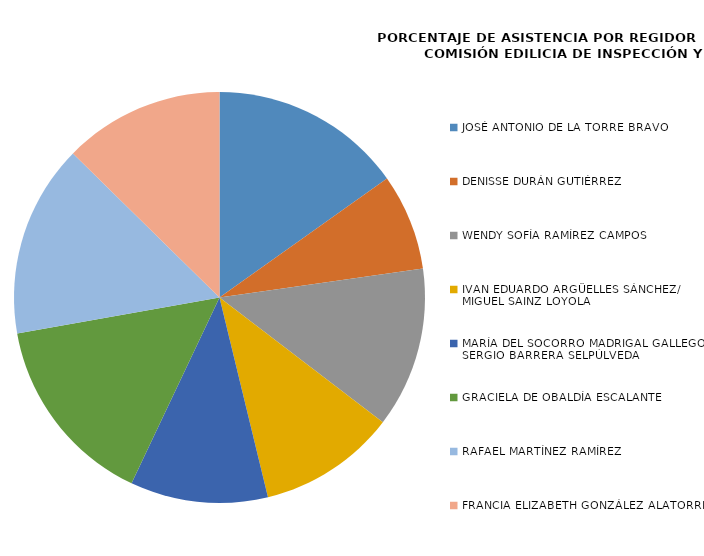
| Category | Series 0 |
|---|---|
| JOSÉ ANTONIO DE LA TORRE BRAVO | 100 |
| DENISSE DURÁN GUTIÉRREZ | 50 |
| WENDY SOFÍA RAMÍREZ CAMPOS | 83.333 |
| IVAN EDUARDO ARGÜELLES SÁNCHEZ/
MIGUEL SAINZ LOYOLA | 71.429 |
| MARÍA DEL SOCORRO MADRIGAL GALLEGOS/
SERGIO BARRERA SELPÚLVEDA | 71.429 |
| GRACIELA DE OBALDÍA ESCALANTE | 100 |
| RAFAEL MARTÍNEZ RAMÍREZ | 100 |
| FRANCIA ELIZABETH GONZÁLEZ ALATORRE | 83.333 |